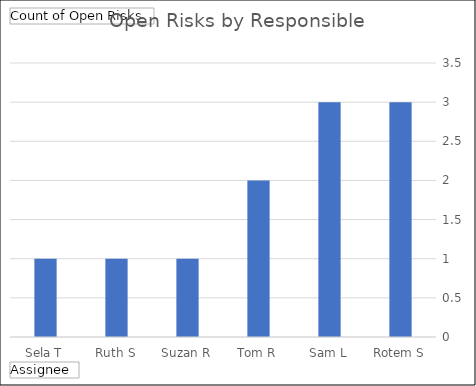
| Category | Total |
|---|---|
| Rotem S | 3 |
| Sam L | 3 |
| Tom R | 2 |
| Suzan R | 1 |
| Ruth S | 1 |
| Sela T | 1 |